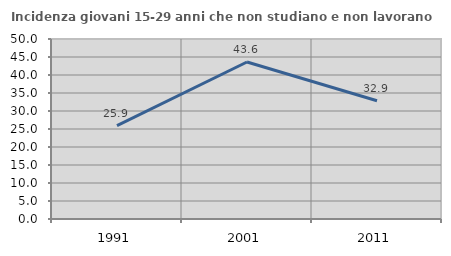
| Category | Incidenza giovani 15-29 anni che non studiano e non lavorano  |
|---|---|
| 1991.0 | 25.949 |
| 2001.0 | 43.614 |
| 2011.0 | 32.855 |